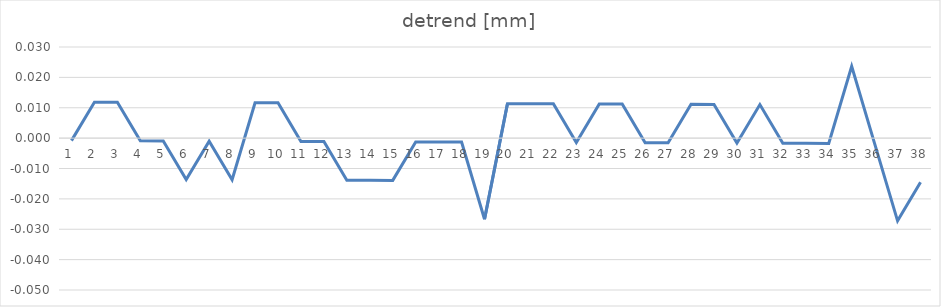
| Category | detrend [mm] |
|---|---|
| 0 | -0.001 |
| 1 | 0.012 |
| 2 | 0.012 |
| 3 | -0.001 |
| 4 | -0.001 |
| 5 | -0.014 |
| 6 | -0.001 |
| 7 | -0.014 |
| 8 | 0.012 |
| 9 | 0.012 |
| 10 | -0.001 |
| 11 | -0.001 |
| 12 | -0.014 |
| 13 | -0.014 |
| 14 | -0.014 |
| 15 | -0.001 |
| 16 | -0.001 |
| 17 | -0.001 |
| 18 | -0.027 |
| 19 | 0.011 |
| 20 | 0.011 |
| 21 | 0.011 |
| 22 | -0.001 |
| 23 | 0.011 |
| 24 | 0.011 |
| 25 | -0.002 |
| 26 | -0.002 |
| 27 | 0.011 |
| 28 | 0.011 |
| 29 | -0.002 |
| 30 | 0.011 |
| 31 | -0.002 |
| 32 | -0.002 |
| 33 | -0.002 |
| 34 | 0.024 |
| 35 | -0.002 |
| 36 | -0.027 |
| 37 | -0.015 |